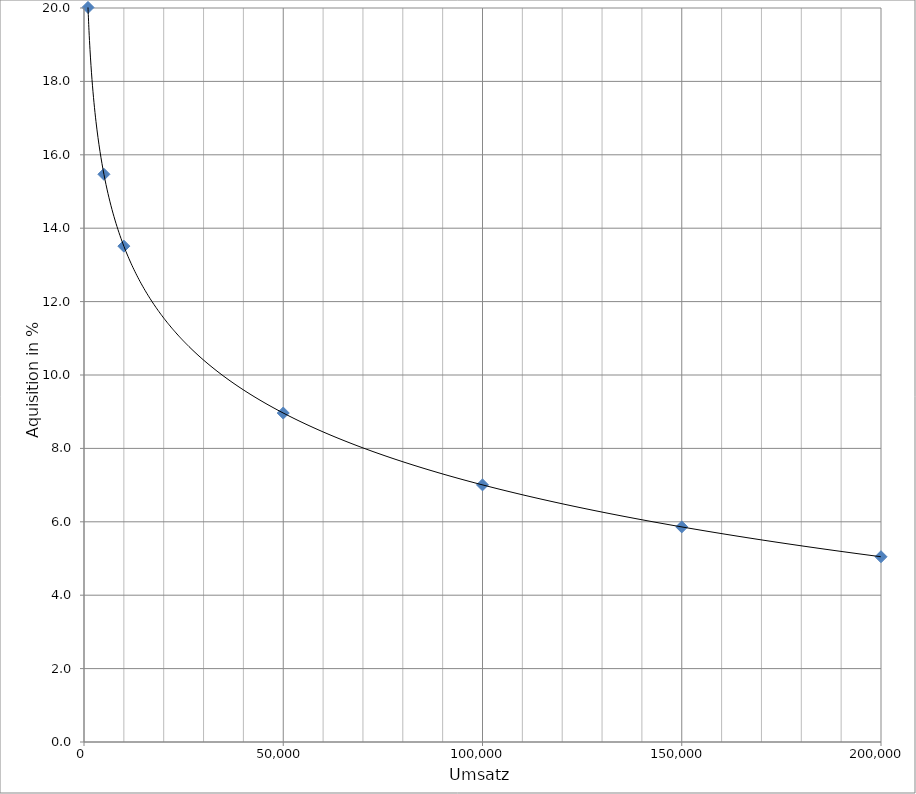
| Category | 111 |
|---|---|
| 1000.0 | 20.016 |
| 5000.0 | 15.469 |
| 10000.0 | 13.511 |
| 50000.0 | 8.964 |
| 100000.0 | 7.006 |
| 150000.0 | 5.861 |
| 200000.0 | 5.048 |